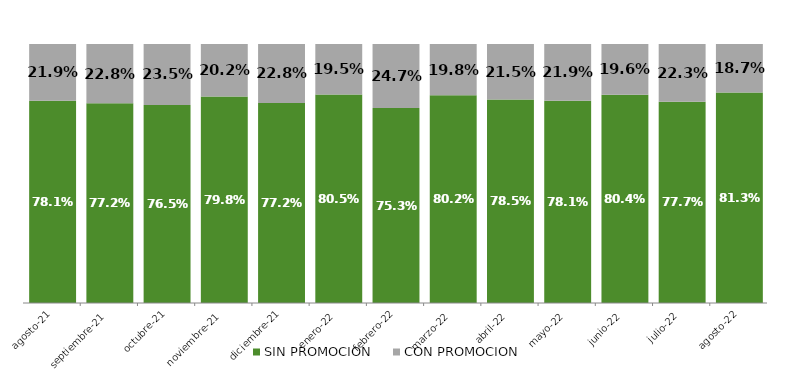
| Category | SIN PROMOCION   | CON PROMOCION   |
|---|---|---|
| 2021-08-01 | 0.781 | 0.219 |
| 2021-09-01 | 0.772 | 0.228 |
| 2021-10-01 | 0.765 | 0.235 |
| 2021-11-01 | 0.798 | 0.202 |
| 2021-12-01 | 0.772 | 0.228 |
| 2022-01-01 | 0.805 | 0.195 |
| 2022-02-01 | 0.753 | 0.247 |
| 2022-03-01 | 0.802 | 0.198 |
| 2022-04-01 | 0.785 | 0.215 |
| 2022-05-01 | 0.781 | 0.219 |
| 2022-06-01 | 0.804 | 0.196 |
| 2022-07-01 | 0.777 | 0.223 |
| 2022-08-01 | 0.813 | 0.187 |